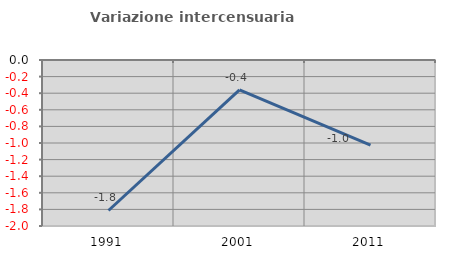
| Category | Variazione intercensuaria annua |
|---|---|
| 1991.0 | -1.813 |
| 2001.0 | -0.36 |
| 2011.0 | -1.026 |